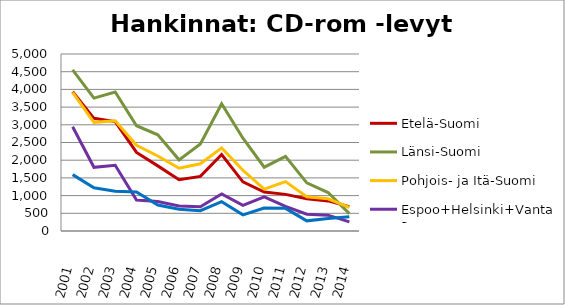
| Category | Etelä-Suomi | Länsi-Suomi | Pohjois- ja Itä-Suomi | Espoo+Helsinki+Vantaa | Muu Uusimaa |
|---|---|---|---|---|---|
| 2001.0 | 3933 | 4552 | 3914 | 2944 | 1593 |
| 2002.0 | 3183 | 3753 | 3069 | 1799 | 1220 |
| 2003.0 | 3091 | 3928 | 3112 | 1858 | 1123 |
| 2004.0 | 2220 | 2975 | 2421 | 875 | 1105 |
| 2005.0 | 1840 | 2717 | 2118 | 834 | 732 |
| 2006.0 | 1449 | 2010 | 1774 | 706 | 614 |
| 2007.0 | 1542 | 2458 | 1899 | 686 | 572 |
| 2008.0 | 2161 | 3595 | 2347 | 1046 | 828 |
| 2009.0 | 1387 | 2622 | 1716 | 722 | 456 |
| 2010.0 | 1100 | 1802 | 1182 | 964 | 650 |
| 2011.0 | 1035 | 2110 | 1395 | 696 | 640 |
| 2012.0 | 912 | 1359 | 969 | 473 | 287 |
| 2013.0 | 850 | 1086 | 910 | 447 | 352 |
| 2014.0 | 689 | 490 | 669 | 257 | 403 |